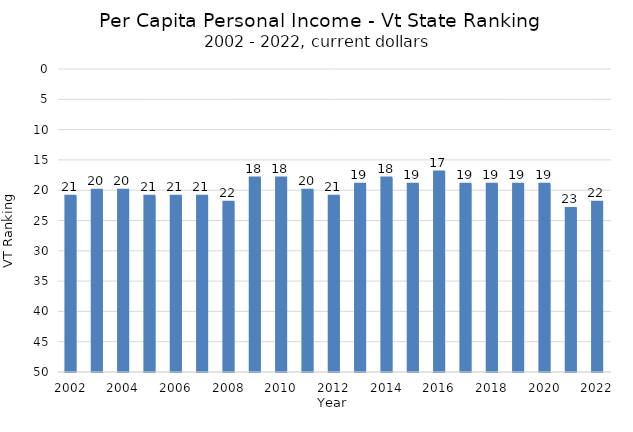
| Category | Vermont |
|---|---|
| 2022 | 22 |
| 2021 | 23 |
| 2020 | 19 |
| 2019 | 19 |
| 2018 | 19 |
| 2017 | 19 |
| 2016 | 17 |
| 2015 | 19 |
| 2014 | 18 |
| 2013 | 19 |
| 2012 | 21 |
| 2011 | 20 |
| 2010 | 18 |
| 2009 | 18 |
| 2008 | 22 |
| 2007 | 21 |
| 2006 | 21 |
| 2005 | 21 |
| 2004 | 20 |
| 2003 | 20 |
| 2002 | 21 |